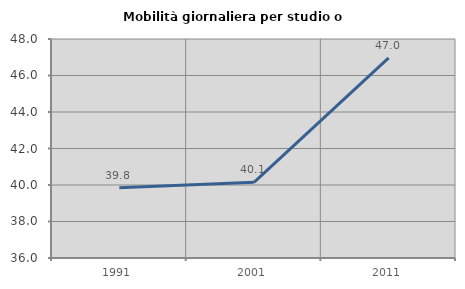
| Category | Mobilità giornaliera per studio o lavoro |
|---|---|
| 1991.0 | 39.848 |
| 2001.0 | 40.148 |
| 2011.0 | 46.97 |